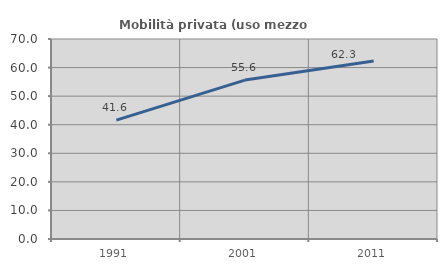
| Category | Mobilità privata (uso mezzo privato) |
|---|---|
| 1991.0 | 41.589 |
| 2001.0 | 55.617 |
| 2011.0 | 62.296 |